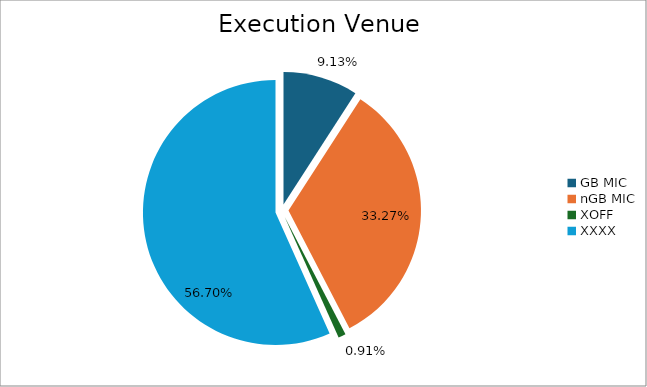
| Category | Series 0 |
|---|---|
| GB MIC | 931554.147 |
| nGB MIC | 3395329.369 |
| XOFF | 93094.916 |
| XXXX | 5786866.447 |